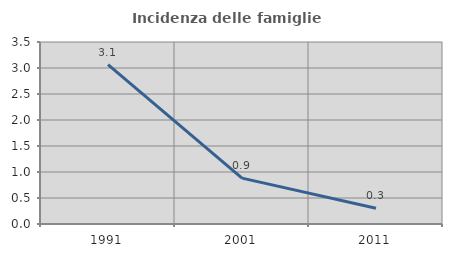
| Category | Incidenza delle famiglie numerose |
|---|---|
| 1991.0 | 3.065 |
| 2001.0 | 0.882 |
| 2011.0 | 0.302 |